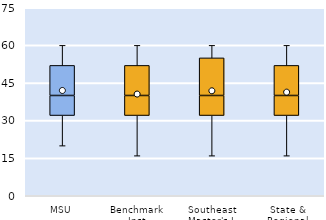
| Category | 25th | 50th | 75th |
|---|---|---|---|
| MSU | 32 | 8 | 12 |
| Benchmark Inst | 32 | 8 | 12 |
| Southeast Master's-L | 32 | 8 | 15 |
| State & Regional | 32 | 8 | 12 |